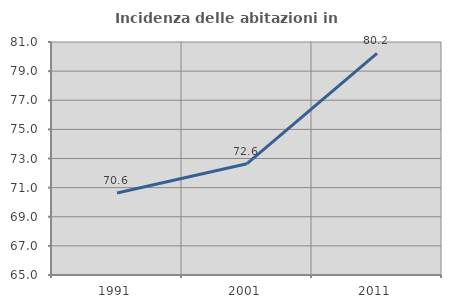
| Category | Incidenza delle abitazioni in proprietà  |
|---|---|
| 1991.0 | 70.625 |
| 2001.0 | 72.643 |
| 2011.0 | 80.221 |